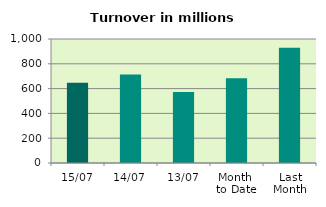
| Category | Series 0 |
|---|---|
| 15/07 | 647.489 |
| 14/07 | 714.565 |
| 13/07 | 571.782 |
| Month 
to Date | 683.6 |
| Last
Month | 929.439 |